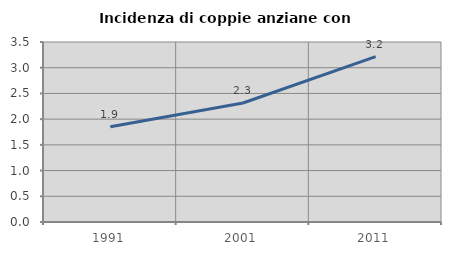
| Category | Incidenza di coppie anziane con figli |
|---|---|
| 1991.0 | 1.854 |
| 2001.0 | 2.314 |
| 2011.0 | 3.214 |